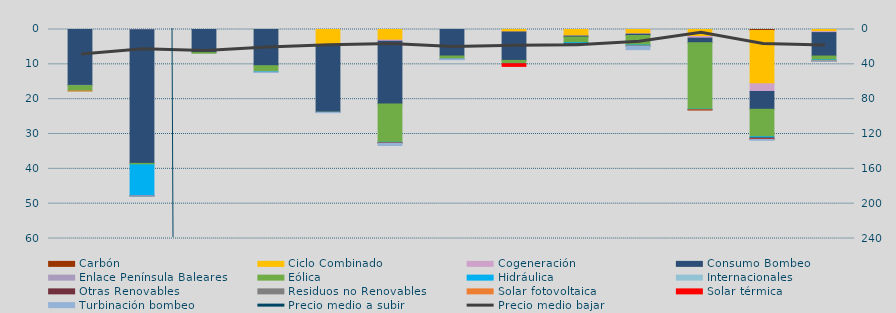
| Category | Carbón | Ciclo Combinado | Cogeneración | Consumo Bombeo | Enlace Península Baleares | Eólica | Hidráulica | Internacionales | Otras Renovables | Residuos no Renovables | Solar fotovoltaica | Solar térmica | Turbinación bombeo |
|---|---|---|---|---|---|---|---|---|---|---|---|---|---|
| 0 | 0 | 0 | 27.2 | 16019.9 | 60 | 1518.5 | 0 | 0 | 0 | 0 | 0.9 | 0 | 0 |
| 1 | 0 | 0 | 106.8 | 38332.5 | 0 | 408.2 | 8886.3 | 0 | 30.1 | 3.6 | 0 | 0 | 44 |
| 2 | 0 | 0 | 0 | 6628.9 | 0 | 183.2 | 0 | 0 | 0 | 0 | 0 | 0 | 0 |
| 3 | 0 | 1.3 | 0 | 10386.9 | 0 | 1741.8 | 75 | 0 | 0 | 0 | 0 | 0 | 139.3 |
| 4 | 0 | 4765.8 | 1.3 | 18991.8 | 0 | 4.2 | 0 | 0 | 0 | 0 | 0 | 0 | 118 |
| 5 | 0 | 3050.9 | 350.1 | 17978.8 | 0 | 10989.6 | 66.4 | 80 | 170.8 | 0 | 2.7 | 0 | 614.9 |
| 6 | 0 | 0 | 0 | 7614.5 | 0 | 781.3 | 105.7 | 0 | 0 | 0 | 2.1 | 0 | 181 |
| 7 | 0 | 720.2 | 1.2 | 8158 | 0 | 874.3 | 55.9 | 0 | 0 | 0 | 0 | 782.4 | 0 |
| 8 | 0 | 1851.6 | 42.3 | 273.4 | 0 | 1634.9 | 310 | 0 | 3.7 | 0 | 0 | 0 | 0 |
| 9 | 0 | 1244.2 | 103.6 | 370.8 | 0 | 2746.7 | 304.8 | 0 | 15.4 | 0 | 0.1 | 0 | 1000.2 |
| 10 | 0 | 2003.8 | 480.6 | 1308.7 | 0 | 19069.4 | 129.7 | 0 | 113.5 | 0 | 2 | 0 | 0 |
| 11 | 274.3 | 15310.9 | 2199.5 | 5123.2 | 0 | 7894.3 | 324.4 | 0 | 365.6 | 0 | 33.3 | 39.3 | 259.1 |
| 12 | 0 | 600 | 290.9 | 6727.7 | 0 | 1121.1 | 272.6 | 0 | 7.6 | 12.5 | 0.4 | 0 | 84 |